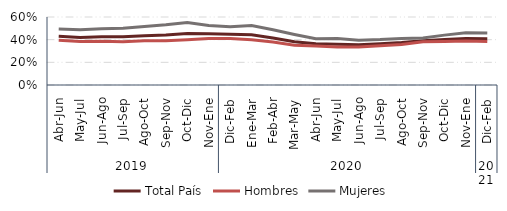
| Category | Total País | Hombres | Mujeres |
|---|---|---|---|
| 0 | 0.43 | 0.396 | 0.493 |
| 1 | 0.42 | 0.383 | 0.487 |
| 2 | 0.426 | 0.386 | 0.497 |
| 3 | 0.425 | 0.382 | 0.501 |
| 4 | 0.435 | 0.39 | 0.516 |
| 5 | 0.44 | 0.39 | 0.531 |
| 6 | 0.454 | 0.399 | 0.551 |
| 7 | 0.452 | 0.411 | 0.525 |
| 8 | 0.447 | 0.409 | 0.513 |
| 9 | 0.444 | 0.4 | 0.525 |
| 10 | 0.416 | 0.379 | 0.487 |
| 11 | 0.382 | 0.352 | 0.445 |
| 12 | 0.364 | 0.344 | 0.408 |
| 13 | 0.359 | 0.336 | 0.409 |
| 14 | 0.354 | 0.335 | 0.396 |
| 15 | 0.364 | 0.347 | 0.401 |
| 16 | 0.375 | 0.358 | 0.411 |
| 17 | 0.391 | 0.381 | 0.414 |
| 18 | 0.4 | 0.383 | 0.44 |
| 19 | 0.411 | 0.389 | 0.461 |
| 20 | 0.408 | 0.384 | 0.46 |